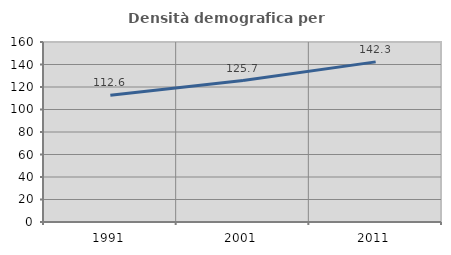
| Category | Densità demografica |
|---|---|
| 1991.0 | 112.649 |
| 2001.0 | 125.68 |
| 2011.0 | 142.331 |